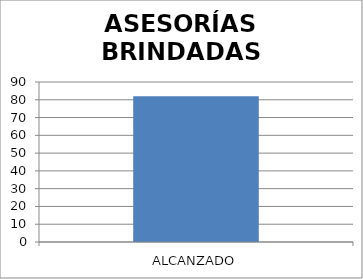
| Category | ASESORÍAS BRINDADAS DSPPA |
|---|---|
| ALCANZADO | 82 |